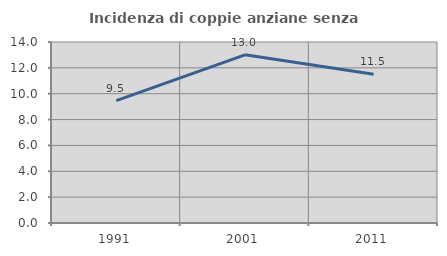
| Category | Incidenza di coppie anziane senza figli  |
|---|---|
| 1991.0 | 9.463 |
| 2001.0 | 13.009 |
| 2011.0 | 11.513 |